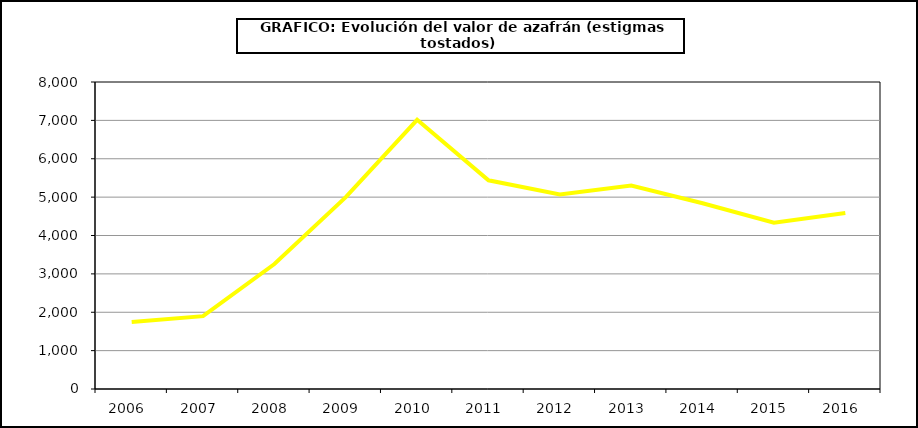
| Category | Valor |
|---|---|
| 2006.0 | 1745.439 |
| 2007.0 | 1898.858 |
| 2008.0 | 3257.208 |
| 2009.0 | 5000.541 |
| 2010.0 | 7014.469 |
| 2011.0 | 5438.177 |
| 2012.0 | 5071.99 |
| 2013.0 | 5302.253 |
| 2014.0 | 4841.325 |
| 2015.0 | 4331 |
| 2016.0 | 4587 |